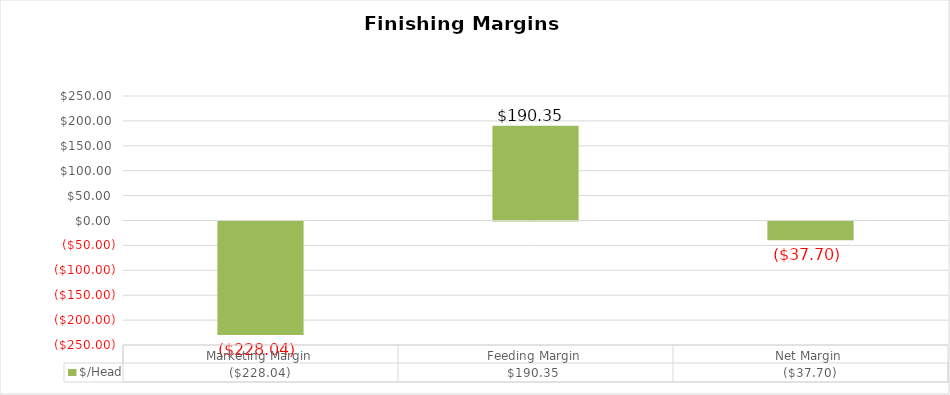
| Category | $/Head |
|---|---|
| Marketing Margin | -228.044 |
| Feeding Margin | 190.347 |
| Net Margin | -37.697 |